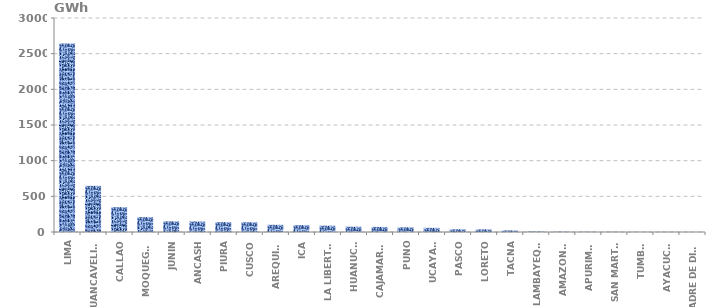
| Category | Series 0 |
|---|---|
| LIMA | 2643.219 |
| HUANCAVELICA | 646.757 |
| CALLAO | 347.555 |
| MOQUEGUA | 208.134 |
| JUNIN | 149.017 |
| ANCASH | 146.854 |
| PIURA | 137.987 |
| CUSCO | 136.195 |
| AREQUIPA | 100.732 |
| ICA | 95.643 |
| LA LIBERTAD | 88.355 |
| HUANUCO | 74.303 |
| CAJAMARCA | 71.081 |
| PUNO | 65.207 |
| UCAYALI | 58.152 |
| PASCO | 38.048 |
| LORETO | 37.093 |
| TACNA | 22.245 |
| LAMBAYEQUE | 6.92 |
| AMAZONAS | 4.18 |
| APURIMAC | 2.449 |
| SAN MARTÍN | 2.188 |
| TUMBES | 1.101 |
| AYACUCHO | 1.032 |
| MADRE DE DIOS | 0.122 |